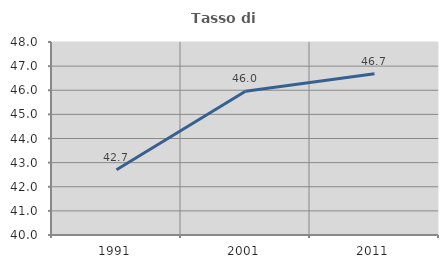
| Category | Tasso di occupazione   |
|---|---|
| 1991.0 | 42.703 |
| 2001.0 | 45.962 |
| 2011.0 | 46.682 |